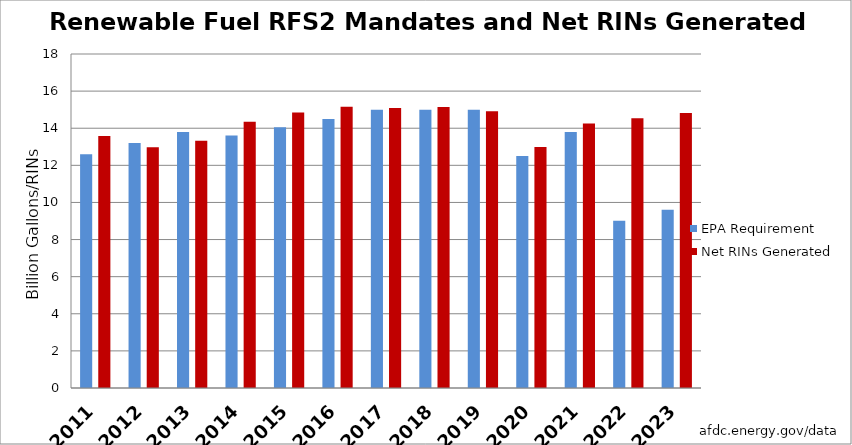
| Category | EPA Requirement | Net RINs Generated |
|---|---|---|
| 2011.0 | 12.6 | 13.587 |
| 2012.0 | 13.2 | 12.981 |
| 2013.0 | 13.8 | 13.326 |
| 2014.0 | 13.61 | 14.345 |
| 2015.0 | 14.05 | 14.842 |
| 2016.0 | 14.5 | 15.157 |
| 2017.0 | 15 | 15.09 |
| 2018.0 | 15 | 15.14 |
| 2019.0 | 15 | 14.92 |
| 2020.0 | 12.5 | 12.986 |
| 2021.0 | 13.79 | 14.258 |
| 2022.0 | 9.02 | 14.537 |
| 2023.0 | 9.6 | 14.816 |